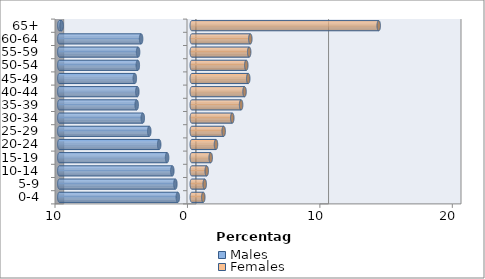
| Category | Males | Females |
|---|---|---|
| 0-4 | -1.054 | 0.868 |
| 5-9 | -1.239 | 0.975 |
| 10-14 | -1.469 | 1.128 |
| 15-19 | -1.864 | 1.428 |
| 20-24 | -2.461 | 1.827 |
| 25-29 | -3.21 | 2.408 |
| 30-34 | -3.7 | 3.058 |
| 35-39 | -4.161 | 3.724 |
| 40-44 | -4.111 | 3.984 |
| 45-49 | -4.301 | 4.264 |
| 50-54 | -4.074 | 4.115 |
| 55-59 | -4.054 | 4.334 |
| 60-64 | -3.827 | 4.42 |
| 65+ | -9.828 | 14.116 |